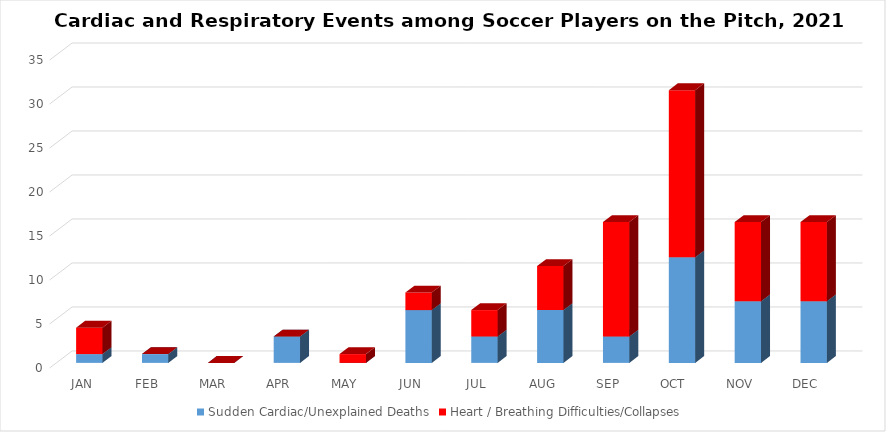
| Category | Sudden Cardiac/Unexplained Deaths | Heart / Breathing Difficulties/Collapses |
|---|---|---|
| JAN | 1 | 3 |
| FEB | 1 | 0 |
| MAR | 0 | 0 |
| APR | 3 | 0 |
| MAY | 0 | 1 |
| JUN | 6 | 2 |
| JUL | 3 | 3 |
| AUG | 6 | 5 |
| SEP | 3 | 13 |
| OCT | 12 | 19 |
| NOV | 7 | 9 |
| DEC | 7 | 9 |